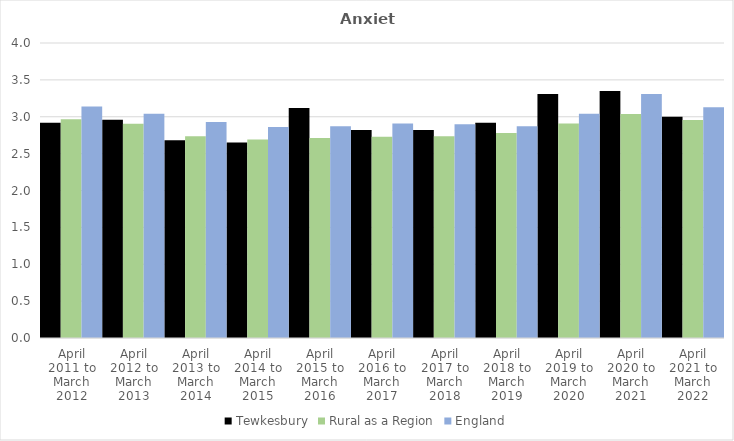
| Category | Tewkesbury | Rural as a Region | England |
|---|---|---|---|
| April 2011 to March 2012 | 2.92 | 2.967 | 3.14 |
| April 2012 to March 2013 | 2.96 | 2.904 | 3.04 |
| April 2013 to March 2014 | 2.68 | 2.734 | 2.93 |
| April 2014 to March 2015 | 2.65 | 2.691 | 2.86 |
| April 2015 to March 2016 | 3.12 | 2.711 | 2.87 |
| April 2016 to March 2017 | 2.82 | 2.729 | 2.91 |
| April 2017 to March 2018 | 2.82 | 2.736 | 2.9 |
| April 2018 to March 2019 | 2.92 | 2.78 | 2.87 |
| April 2019 to March 2020 | 3.31 | 2.908 | 3.04 |
| April 2020 to March 2021 | 3.35 | 3.036 | 3.31 |
| April 2021 to March 2022 | 3 | 2.956 | 3.13 |